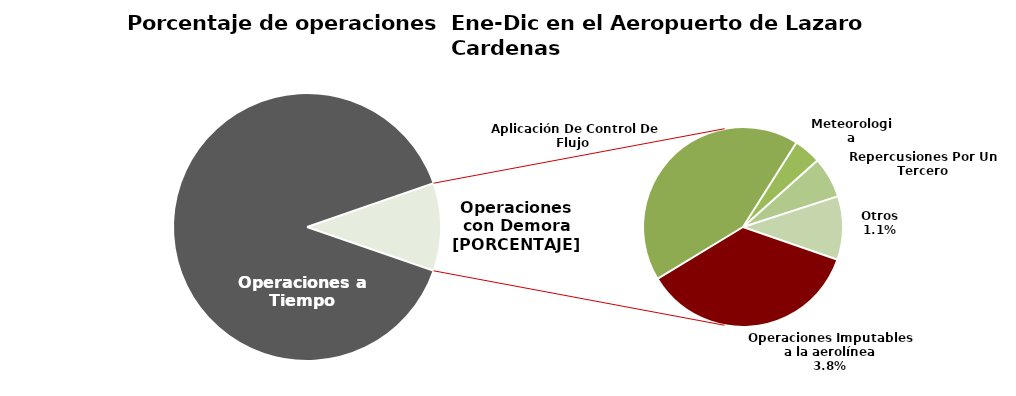
| Category | Series 0 |
|---|---|
| Operaciones a Tiempo | 1147 |
| Operaciones Imputables a la aerolínea | 49 |
| Aplicación De Control De Flujo  | 58 |
| Meteorologia | 6 |
| Repercusiones Por Un Tercero | 9 |
| Otros | 14 |